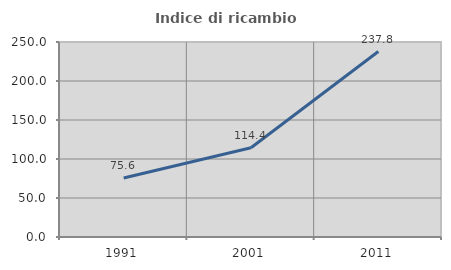
| Category | Indice di ricambio occupazionale  |
|---|---|
| 1991.0 | 75.61 |
| 2001.0 | 114.439 |
| 2011.0 | 237.762 |